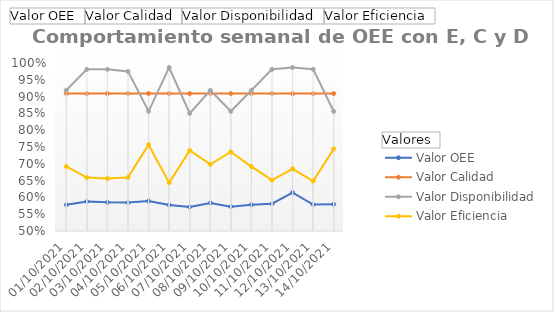
| Category | Valor OEE | Valor Calidad | Valor Disponibilidad | Valor Eficiencia |
|---|---|---|---|---|
| 01/10/2021 | 0.578 | 0.909 | 0.919 | 0.692 |
| 02/10/2021 | 0.588 | 0.909 | 0.981 | 0.659 |
| 03/10/2021 | 0.585 | 0.909 | 0.981 | 0.656 |
| 04/10/2021 | 0.585 | 0.909 | 0.975 | 0.66 |
| 05/10/2021 | 0.589 | 0.909 | 0.856 | 0.757 |
| 06/10/2021 | 0.577 | 0.909 | 0.987 | 0.644 |
| 07/10/2021 | 0.572 | 0.909 | 0.85 | 0.74 |
| 08/10/2021 | 0.583 | 0.909 | 0.919 | 0.699 |
| 09/10/2021 | 0.572 | 0.909 | 0.856 | 0.735 |
| 10/10/2021 | 0.578 | 0.909 | 0.919 | 0.692 |
| 11/10/2021 | 0.581 | 0.909 | 0.981 | 0.652 |
| 12/10/2021 | 0.614 | 0.909 | 0.987 | 0.685 |
| 13/10/2021 | 0.579 | 0.909 | 0.981 | 0.649 |
| 14/10/2021 | 0.579 | 0.909 | 0.856 | 0.744 |